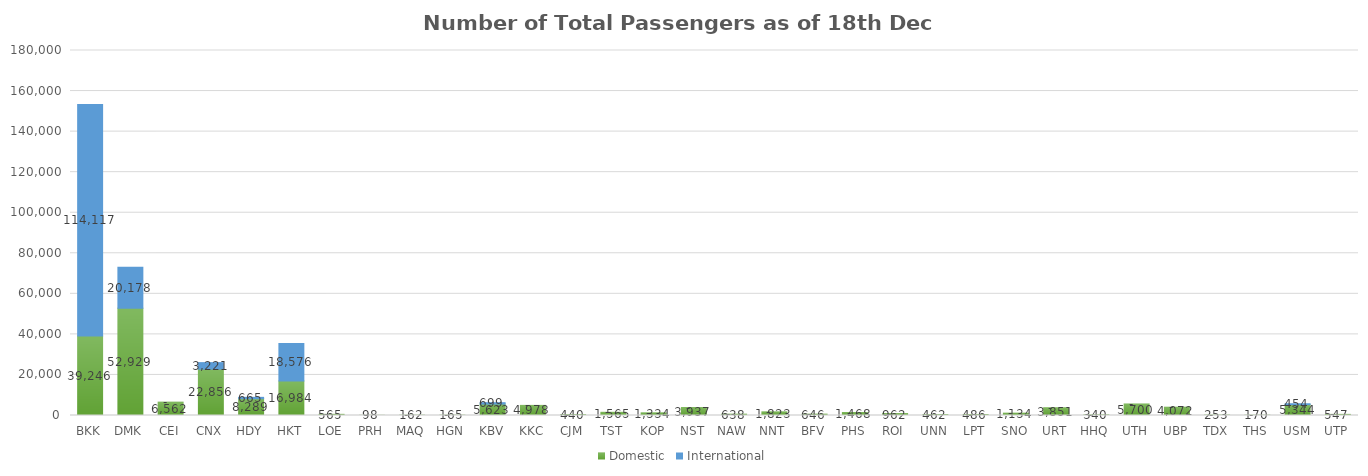
| Category | Domestic | International |
|---|---|---|
| BKK | 39246 | 114117 |
| DMK | 52929 | 20178 |
| CEI | 6562 | 0 |
| CNX | 22856 | 3221 |
| HDY | 8289 | 665 |
| HKT | 16984 | 18576 |
| LOE | 565 | 0 |
| PRH | 98 | 0 |
| MAQ | 162 | 0 |
| HGN | 165 | 0 |
| KBV | 5623 | 699 |
| KKC | 4978 | 0 |
| CJM | 440 | 0 |
| TST | 1565 | 0 |
| KOP | 1334 | 0 |
| NST | 3937 | 0 |
| NAW | 638 | 0 |
| NNT | 1823 | 0 |
| BFV | 646 | 0 |
| PHS | 1468 | 0 |
| ROI | 962 | 0 |
| UNN | 462 | 0 |
| LPT | 486 | 0 |
| SNO | 1134 | 0 |
| URT | 3851 | 0 |
| HHQ | 340 | 0 |
| UTH | 5700 | 0 |
| UBP | 4072 | 0 |
| TDX | 253 | 0 |
| THS | 170 | 0 |
| USM | 5344 | 454 |
| UTP | 547 | 0 |